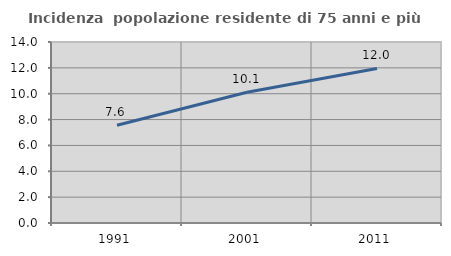
| Category | Incidenza  popolazione residente di 75 anni e più |
|---|---|
| 1991.0 | 7.562 |
| 2001.0 | 10.107 |
| 2011.0 | 11.953 |